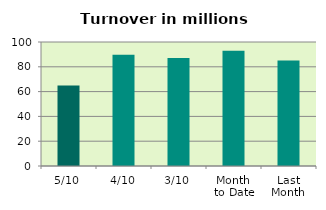
| Category | Series 0 |
|---|---|
| 5/10 | 64.919 |
| 4/10 | 89.735 |
| 3/10 | 87.094 |
| Month 
to Date | 92.875 |
| Last
Month | 85.072 |